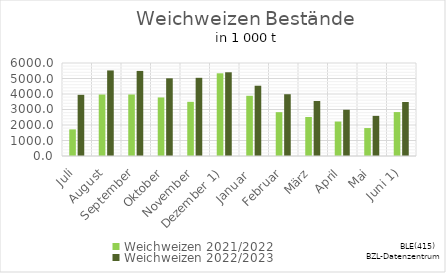
| Category | Weichweizen |
|---|---|
| Juli | 3946.604 |
| August | 5520.476 |
| September | 5488.945 |
| Oktober | 5012.895 |
| November | 5043.961 |
| Dezember 1) | 5402.136 |
| Januar  | 4533.647 |
| Februar | 3985.086 |
| März | 3550.208 |
| April | 2983.151 |
| Mai | 2588.362 |
| Juni 1) | 3484.118 |